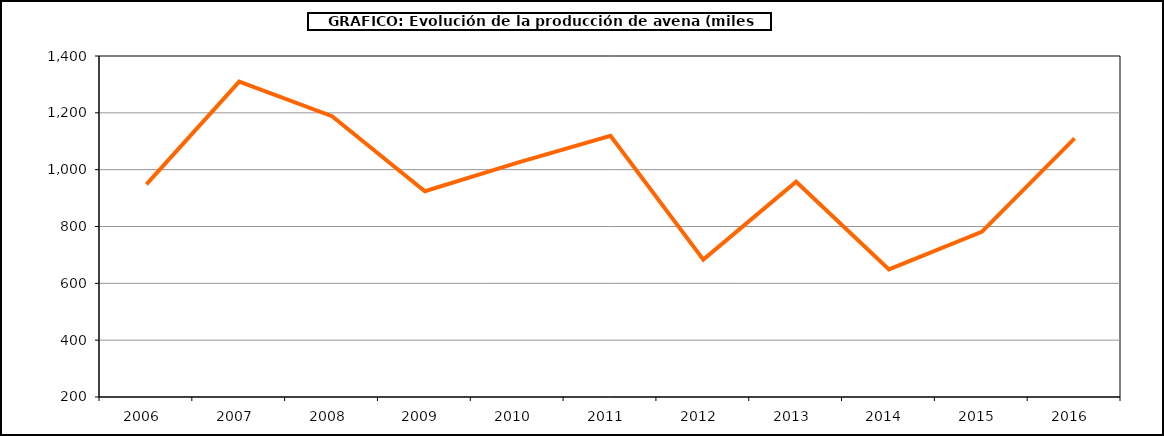
| Category | Superficie |
|---|---|
| 2006.0 | 948.115 |
| 2007.0 | 1309.945 |
| 2008.0 | 1188.33 |
| 2009.0 | 923.946 |
| 2010.0 | 1024.661 |
| 2011.0 | 1119.214 |
| 2012.0 | 683.482 |
| 2013.0 | 957.662 |
| 2014.0 | 649.194 |
| 2015.0 | 781.048 |
| 2016.0 | 1110.117 |